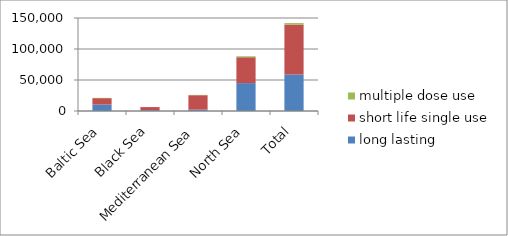
| Category | long lasting | short life single use | multiple dose use |
|---|---|---|---|
| Baltic Sea | 10337 | 10341 | 512 |
| Black Sea | 1254 | 5079 | 54 |
| Mediterranean Sea | 2196 | 23252 | 539 |
| North Sea | 45014 | 41664 | 1569 |
| Total | 58801 | 80336 | 2674 |